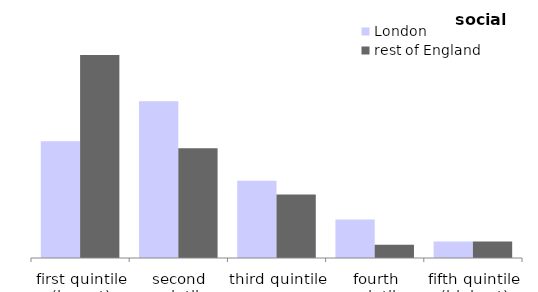
| Category | London | rest of England |
|---|---|---|
| first quintile (lowest) | 28.776 | 49.97 |
| second quintile | 38.628 | 27.046 |
| third quintile | 19.028 | 15.619 |
| fourth quintile | 9.5 | 3.28 |
| fifth quintile (highest) | 4.068 | 4.083 |